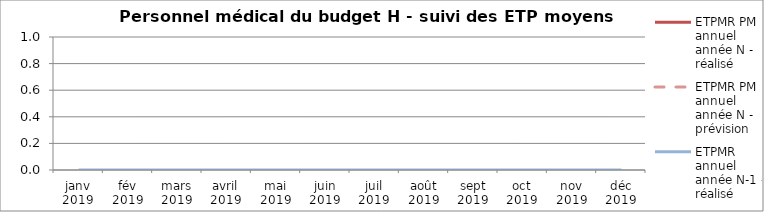
| Category | ETPMR PM annuel année N - réalisé | ETPMR PM annuel année N - prévision | ETPMR annuel année N-1 - réalisé |
|---|---|---|---|
| janv 2019 |  |  | 0 |
| fév 2019 |  |  | 0 |
| mars 2019 |  |  | 0 |
| avril 2019 |  |  | 0 |
| mai 2019 |  |  | 0 |
| juin 2019 |  |  | 0 |
| juil 2019 |  |  | 0 |
| août 2019 |  |  | 0 |
| sept 2019 |  |  | 0 |
| oct 2019 |  |  | 0 |
| nov 2019 |  |  | 0 |
| déc 2019 |  |  | 0 |